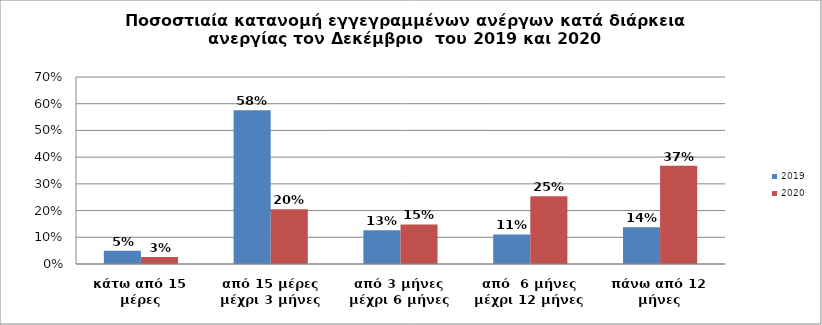
| Category | 2019 | 2020 |
|---|---|---|
| κάτω από 15 μέρες | 0.05 | 0.026 |
| από 15 μέρες μέχρι 3 μήνες | 0.575 | 0.205 |
| από 3 μήνες μέχρι 6 μήνες | 0.126 | 0.148 |
| από  6 μήνες μέχρι 12 μήνες | 0.111 | 0.253 |
| πάνω από 12 μήνες | 0.138 | 0.368 |